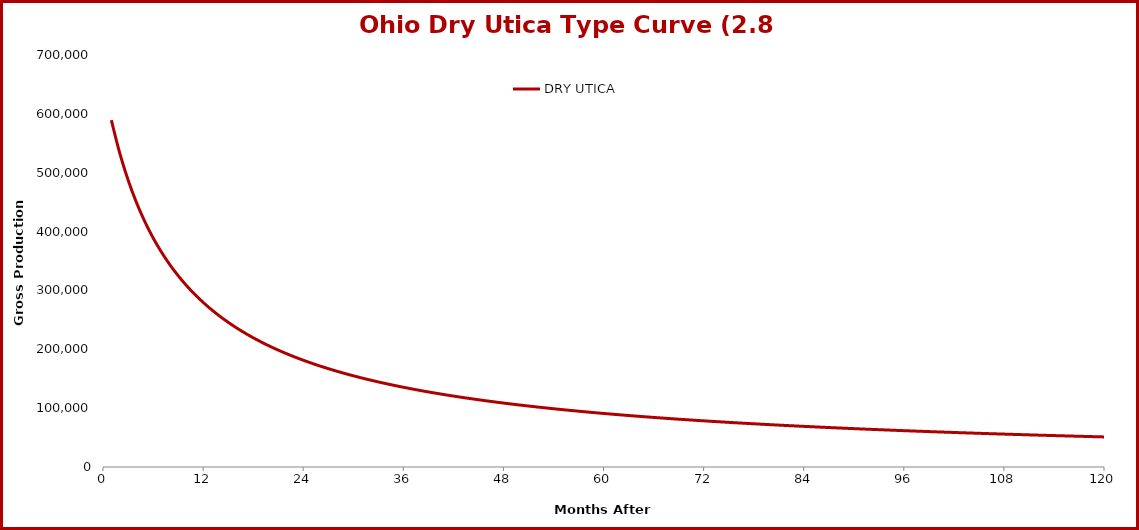
| Category | DRY UTICA |
|---|---|
| 1.0 | 589317 |
| 2.0 | 533595 |
| 3.0 | 487903 |
| 4.0 | 449725 |
| 5.0 | 417326 |
| 6.0 | 389472 |
| 7.0 | 365256 |
| 8.0 | 344001 |
| 9.0 | 325187 |
| 10.0 | 308413 |
| 11.0 | 293358 |
| 12.0 | 279768 |
| 13.0 | 267437 |
| 14.0 | 256194 |
| 15.0 | 245900 |
| 16.0 | 236439 |
| 17.0 | 227710 |
| 18.0 | 219632 |
| 19.0 | 212134 |
| 20.0 | 205153 |
| 21.0 | 198638 |
| 22.0 | 192543 |
| 23.0 | 186828 |
| 24.0 | 181458 |
| 25.0 | 176402 |
| 26.0 | 171634 |
| 27.0 | 167128 |
| 28.0 | 162863 |
| 29.0 | 158821 |
| 30.0 | 154984 |
| 31.0 | 151337 |
| 32.0 | 147865 |
| 33.0 | 144557 |
| 34.0 | 141400 |
| 35.0 | 138384 |
| 36.0 | 135501 |
| 37.0 | 132741 |
| 38.0 | 130096 |
| 39.0 | 127560 |
| 40.0 | 125125 |
| 41.0 | 122786 |
| 42.0 | 120537 |
| 43.0 | 118373 |
| 44.0 | 116288 |
| 45.0 | 114280 |
| 46.0 | 112343 |
| 47.0 | 110473 |
| 48.0 | 108668 |
| 49.0 | 106923 |
| 50.0 | 105237 |
| 51.0 | 103605 |
| 52.0 | 102025 |
| 53.0 | 100496 |
| 54.0 | 99013 |
| 55.0 | 97576 |
| 56.0 | 96182 |
| 57.0 | 94829 |
| 58.0 | 93516 |
| 59.0 | 92240 |
| 60.0 | 91000 |
| 61.0 | 89794 |
| 62.0 | 88622 |
| 63.0 | 87481 |
| 64.0 | 86371 |
| 65.0 | 85290 |
| 66.0 | 84237 |
| 67.0 | 83211 |
| 68.0 | 82211 |
| 69.0 | 81235 |
| 70.0 | 80284 |
| 71.0 | 79356 |
| 72.0 | 78450 |
| 73.0 | 77566 |
| 74.0 | 76702 |
| 75.0 | 75858 |
| 76.0 | 75033 |
| 77.0 | 74227 |
| 78.0 | 73439 |
| 79.0 | 72669 |
| 80.0 | 71915 |
| 81.0 | 71177 |
| 82.0 | 70455 |
| 83.0 | 69748 |
| 84.0 | 69057 |
| 85.0 | 68379 |
| 86.0 | 67715 |
| 87.0 | 67064 |
| 88.0 | 66427 |
| 89.0 | 65802 |
| 90.0 | 65189 |
| 91.0 | 64588 |
| 92.0 | 63999 |
| 93.0 | 63421 |
| 94.0 | 62854 |
| 95.0 | 62297 |
| 96.0 | 61750 |
| 97.0 | 61214 |
| 98.0 | 60687 |
| 99.0 | 60170 |
| 100.0 | 59661 |
| 101.0 | 59162 |
| 102.0 | 58672 |
| 103.0 | 58189 |
| 104.0 | 57716 |
| 105.0 | 57250 |
| 106.0 | 56792 |
| 107.0 | 56341 |
| 108.0 | 55898 |
| 109.0 | 55463 |
| 110.0 | 55034 |
| 111.0 | 54612 |
| 112.0 | 54197 |
| 113.0 | 53789 |
| 114.0 | 53387 |
| 115.0 | 52991 |
| 116.0 | 52601 |
| 117.0 | 52218 |
| 118.0 | 51840 |
| 119.0 | 51468 |
| 120.0 | 51101 |
| 121.0 | 50740 |
| 122.0 | 50384 |
| 123.0 | 50034 |
| 124.0 | 49688 |
| 125.0 | 49347 |
| 126.0 | 49012 |
| 127.0 | 48681 |
| 128.0 | 48354 |
| 129.0 | 48033 |
| 130.0 | 47715 |
| 131.0 | 47403 |
| 132.0 | 47094 |
| 133.0 | 46789 |
| 134.0 | 46489 |
| 135.0 | 46193 |
| 136.0 | 45900 |
| 137.0 | 45612 |
| 138.0 | 45327 |
| 139.0 | 45046 |
| 140.0 | 44769 |
| 141.0 | 44495 |
| 142.0 | 44225 |
| 143.0 | 43958 |
| 144.0 | 43694 |
| 145.0 | 43434 |
| 146.0 | 43177 |
| 147.0 | 42923 |
| 148.0 | 42672 |
| 149.0 | 42425 |
| 150.0 | 42180 |
| 151.0 | 41938 |
| 152.0 | 41700 |
| 153.0 | 41464 |
| 154.0 | 41230 |
| 155.0 | 41000 |
| 156.0 | 40772 |
| 157.0 | 40547 |
| 158.0 | 40324 |
| 159.0 | 40104 |
| 160.0 | 39887 |
| 161.0 | 39672 |
| 162.0 | 39459 |
| 163.0 | 39249 |
| 164.0 | 39041 |
| 165.0 | 38836 |
| 166.0 | 38632 |
| 167.0 | 38431 |
| 168.0 | 38232 |
| 169.0 | 38035 |
| 170.0 | 37840 |
| 171.0 | 37645 |
| 172.0 | 37451 |
| 173.0 | 37259 |
| 174.0 | 37067 |
| 175.0 | 36877 |
| 176.0 | 36687 |
| 177.0 | 36498 |
| 178.0 | 36311 |
| 179.0 | 36124 |
| 180.0 | 35938 |
| 181.0 | 35753 |
| 182.0 | 35569 |
| 183.0 | 35386 |
| 184.0 | 35204 |
| 185.0 | 35023 |
| 186.0 | 34843 |
| 187.0 | 34664 |
| 188.0 | 34486 |
| 189.0 | 34308 |
| 190.0 | 34132 |
| 191.0 | 33956 |
| 192.0 | 33782 |
| 193.0 | 33608 |
| 194.0 | 33435 |
| 195.0 | 33263 |
| 196.0 | 33092 |
| 197.0 | 32922 |
| 198.0 | 32753 |
| 199.0 | 32584 |
| 200.0 | 32417 |
| 201.0 | 32250 |
| 202.0 | 32084 |
| 203.0 | 31919 |
| 204.0 | 31755 |
| 205.0 | 31592 |
| 206.0 | 31429 |
| 207.0 | 31267 |
| 208.0 | 31107 |
| 209.0 | 30947 |
| 210.0 | 30787 |
| 211.0 | 30629 |
| 212.0 | 30472 |
| 213.0 | 30315 |
| 214.0 | 30159 |
| 215.0 | 30004 |
| 216.0 | 29850 |
| 217.0 | 29696 |
| 218.0 | 29543 |
| 219.0 | 29391 |
| 220.0 | 29240 |
| 221.0 | 29090 |
| 222.0 | 28940 |
| 223.0 | 28791 |
| 224.0 | 28643 |
| 225.0 | 28496 |
| 226.0 | 28349 |
| 227.0 | 28204 |
| 228.0 | 28059 |
| 229.0 | 27914 |
| 230.0 | 27771 |
| 231.0 | 27628 |
| 232.0 | 27486 |
| 233.0 | 27344 |
| 234.0 | 27204 |
| 235.0 | 27064 |
| 236.0 | 26925 |
| 237.0 | 26786 |
| 238.0 | 26648 |
| 239.0 | 26511 |
| 240.0 | 26375 |
| 241.0 | 26239 |
| 242.0 | 26104 |
| 243.0 | 25970 |
| 244.0 | 25837 |
| 245.0 | 25704 |
| 246.0 | 25572 |
| 247.0 | 25440 |
| 248.0 | 25309 |
| 249.0 | 25179 |
| 250.0 | 25050 |
| 251.0 | 24921 |
| 252.0 | 24793 |
| 253.0 | 24665 |
| 254.0 | 24538 |
| 255.0 | 24412 |
| 256.0 | 24286 |
| 257.0 | 24162 |
| 258.0 | 24037 |
| 259.0 | 23914 |
| 260.0 | 23791 |
| 261.0 | 23668 |
| 262.0 | 23547 |
| 263.0 | 23425 |
| 264.0 | 23305 |
| 265.0 | 23185 |
| 266.0 | 23066 |
| 267.0 | 22947 |
| 268.0 | 22829 |
| 269.0 | 22712 |
| 270.0 | 22595 |
| 271.0 | 22479 |
| 272.0 | 22363 |
| 273.0 | 22248 |
| 274.0 | 22134 |
| 275.0 | 22020 |
| 276.0 | 21907 |
| 277.0 | 21794 |
| 278.0 | 21682 |
| 279.0 | 21570 |
| 280.0 | 21460 |
| 281.0 | 21349 |
| 282.0 | 21239 |
| 283.0 | 21130 |
| 284.0 | 21021 |
| 285.0 | 20913 |
| 286.0 | 20806 |
| 287.0 | 20699 |
| 288.0 | 20592 |
| 289.0 | 20486 |
| 290.0 | 20381 |
| 291.0 | 20276 |
| 292.0 | 20172 |
| 293.0 | 20068 |
| 294.0 | 19965 |
| 295.0 | 19862 |
| 296.0 | 19760 |
| 297.0 | 19659 |
| 298.0 | 19557 |
| 299.0 | 19457 |
| 300.0 | 19357 |
| 301.0 | 19257 |
| 302.0 | 19158 |
| 303.0 | 19060 |
| 304.0 | 18962 |
| 305.0 | 18864 |
| 306.0 | 18767 |
| 307.0 | 18671 |
| 308.0 | 18575 |
| 309.0 | 18479 |
| 310.0 | 18384 |
| 311.0 | 18289 |
| 312.0 | 18195 |
| 313.0 | 18102 |
| 314.0 | 18009 |
| 315.0 | 17916 |
| 316.0 | 17824 |
| 317.0 | 17732 |
| 318.0 | 17641 |
| 319.0 | 17550 |
| 320.0 | 17460 |
| 321.0 | 17370 |
| 322.0 | 17281 |
| 323.0 | 17192 |
| 324.0 | 17104 |
| 325.0 | 17016 |
| 326.0 | 16928 |
| 327.0 | 16841 |
| 328.0 | 16754 |
| 329.0 | 16668 |
| 330.0 | 16583 |
| 331.0 | 16497 |
| 332.0 | 16412 |
| 333.0 | 16328 |
| 334.0 | 16244 |
| 335.0 | 16161 |
| 336.0 | 16077 |
| 337.0 | 15995 |
| 338.0 | 15912 |
| 339.0 | 15831 |
| 340.0 | 15749 |
| 341.0 | 15668 |
| 342.0 | 15588 |
| 343.0 | 15507 |
| 344.0 | 15428 |
| 345.0 | 15348 |
| 346.0 | 15269 |
| 347.0 | 15191 |
| 348.0 | 15113 |
| 349.0 | 15035 |
| 350.0 | 14958 |
| 351.0 | 14881 |
| 352.0 | 14804 |
| 353.0 | 14728 |
| 354.0 | 14652 |
| 355.0 | 14577 |
| 356.0 | 14502 |
| 357.0 | 14427 |
| 358.0 | 14353 |
| 359.0 | 14279 |
| 360.0 | 14206 |
| 361.0 | 14133 |
| 362.0 | 14060 |
| 363.0 | 13988 |
| 364.0 | 13916 |
| 365.0 | 13844 |
| 366.0 | 13773 |
| 367.0 | 13702 |
| 368.0 | 13632 |
| 369.0 | 13562 |
| 370.0 | 13492 |
| 371.0 | 13423 |
| 372.0 | 13354 |
| 373.0 | 13285 |
| 374.0 | 13217 |
| 375.0 | 13149 |
| 376.0 | 13081 |
| 377.0 | 13014 |
| 378.0 | 12947 |
| 379.0 | 12880 |
| 380.0 | 12814 |
| 381.0 | 12748 |
| 382.0 | 12683 |
| 383.0 | 12617 |
| 384.0 | 12552 |
| 385.0 | 12488 |
| 386.0 | 12424 |
| 387.0 | 12360 |
| 388.0 | 12296 |
| 389.0 | 12233 |
| 390.0 | 12170 |
| 391.0 | 12107 |
| 392.0 | 12045 |
| 393.0 | 11983 |
| 394.0 | 11922 |
| 395.0 | 11860 |
| 396.0 | 11799 |
| 397.0 | 11739 |
| 398.0 | 11678 |
| 399.0 | 11618 |
| 400.0 | 11558 |
| 401.0 | 11499 |
| 402.0 | 11440 |
| 403.0 | 11381 |
| 404.0 | 11322 |
| 405.0 | 11264 |
| 406.0 | 11206 |
| 407.0 | 11149 |
| 408.0 | 11091 |
| 409.0 | 11034 |
| 410.0 | 10978 |
| 411.0 | 10921 |
| 412.0 | 10865 |
| 413.0 | 10809 |
| 414.0 | 10753 |
| 415.0 | 10698 |
| 416.0 | 10643 |
| 417.0 | 10588 |
| 418.0 | 10534 |
| 419.0 | 10480 |
| 420.0 | 10426 |
| 421.0 | 10372 |
| 422.0 | 10319 |
| 423.0 | 10266 |
| 424.0 | 10213 |
| 425.0 | 10160 |
| 426.0 | 10108 |
| 427.0 | 10056 |
| 428.0 | 10005 |
| 429.0 | 9953 |
| 430.0 | 9902 |
| 431.0 | 9851 |
| 432.0 | 9800 |
| 433.0 | 9750 |
| 434.0 | 9700 |
| 435.0 | 9650 |
| 436.0 | 9600 |
| 437.0 | 9551 |
| 438.0 | 9502 |
| 439.0 | 9453 |
| 440.0 | 9404 |
| 441.0 | 9356 |
| 442.0 | 9308 |
| 443.0 | 9260 |
| 444.0 | 9212 |
| 445.0 | 9165 |
| 446.0 | 9118 |
| 447.0 | 9071 |
| 448.0 | 9024 |
| 449.0 | 8978 |
| 450.0 | 8932 |
| 451.0 | 8886 |
| 452.0 | 8840 |
| 453.0 | 8795 |
| 454.0 | 8749 |
| 455.0 | 8704 |
| 456.0 | 8660 |
| 457.0 | 8615 |
| 458.0 | 8571 |
| 459.0 | 8527 |
| 460.0 | 8483 |
| 461.0 | 8439 |
| 462.0 | 8396 |
| 463.0 | 8353 |
| 464.0 | 8310 |
| 465.0 | 8267 |
| 466.0 | 8224 |
| 467.0 | 8182 |
| 468.0 | 8140 |
| 469.0 | 8098 |
| 470.0 | 8056 |
| 471.0 | 8015 |
| 472.0 | 7974 |
| 473.0 | 7933 |
| 474.0 | 7892 |
| 475.0 | 7851 |
| 476.0 | 7811 |
| 477.0 | 7771 |
| 478.0 | 7731 |
| 479.0 | 7691 |
| 480.0 | 7652 |
| 481.0 | 7612 |
| 482.0 | 7573 |
| 483.0 | 7534 |
| 484.0 | 7495 |
| 485.0 | 7457 |
| 486.0 | 7418 |
| 487.0 | 7380 |
| 488.0 | 7342 |
| 489.0 | 7305 |
| 490.0 | 7267 |
| 491.0 | 7230 |
| 492.0 | 7192 |
| 493.0 | 7155 |
| 494.0 | 7119 |
| 495.0 | 7082 |
| 496.0 | 7046 |
| 497.0 | 7009 |
| 498.0 | 6973 |
| 499.0 | 6938 |
| 500.0 | 6902 |
| 501.0 | 6866 |
| 502.0 | 6831 |
| 503.0 | 6796 |
| 504.0 | 6761 |
| 505.0 | 6726 |
| 506.0 | 6692 |
| 507.0 | 6657 |
| 508.0 | 6623 |
| 509.0 | 6589 |
| 510.0 | 6555 |
| 511.0 | 6521 |
| 512.0 | 6488 |
| 513.0 | 6454 |
| 514.0 | 6421 |
| 515.0 | 6388 |
| 516.0 | 6355 |
| 517.0 | 6323 |
| 518.0 | 6290 |
| 519.0 | 6258 |
| 520.0 | 6226 |
| 521.0 | 6194 |
| 522.0 | 6162 |
| 523.0 | 6130 |
| 524.0 | 6098 |
| 525.0 | 6067 |
| 526.0 | 6036 |
| 527.0 | 6005 |
| 528.0 | 5974 |
| 529.0 | 5943 |
| 530.0 | 5913 |
| 531.0 | 5882 |
| 532.0 | 5852 |
| 533.0 | 5822 |
| 534.0 | 5792 |
| 535.0 | 5762 |
| 536.0 | 5733 |
| 537.0 | 5703 |
| 538.0 | 5674 |
| 539.0 | 5645 |
| 540.0 | 5616 |
| 541.0 | 5587 |
| 542.0 | 5558 |
| 543.0 | 5529 |
| 544.0 | 5501 |
| 545.0 | 5473 |
| 546.0 | 5444 |
| 547.0 | 5416 |
| 548.0 | 5389 |
| 549.0 | 5361 |
| 550.0 | 5333 |
| 551.0 | 5306 |
| 552.0 | 5279 |
| 553.0 | 5251 |
| 554.0 | 5224 |
| 555.0 | 5198 |
| 556.0 | 5171 |
| 557.0 | 5144 |
| 558.0 | 5118 |
| 559.0 | 5091 |
| 560.0 | 5065 |
| 561.0 | 5039 |
| 562.0 | 5013 |
| 563.0 | 4988 |
| 564.0 | 4962 |
| 565.0 | 4936 |
| 566.0 | 4911 |
| 567.0 | 4886 |
| 568.0 | 4861 |
| 569.0 | 4836 |
| 570.0 | 4811 |
| 571.0 | 4786 |
| 572.0 | 4761 |
| 573.0 | 4737 |
| 574.0 | 4713 |
| 575.0 | 4688 |
| 576.0 | 4664 |
| 577.0 | 4640 |
| 578.0 | 4616 |
| 579.0 | 4593 |
| 580.0 | 4569 |
| 581.0 | 4545 |
| 582.0 | 4522 |
| 583.0 | 4499 |
| 584.0 | 4476 |
| 585.0 | 4453 |
| 586.0 | 4430 |
| 587.0 | 4407 |
| 588.0 | 4384 |
| 589.0 | 4362 |
| 590.0 | 4339 |
| 591.0 | 4317 |
| 592.0 | 4295 |
| 593.0 | 4273 |
| 594.0 | 4251 |
| 595.0 | 4229 |
| 596.0 | 4207 |
| 597.0 | 4186 |
| 598.0 | 4164 |
| 599.0 | 4143 |
| 600.0 | 4121 |
| 601.0 | 4100 |
| 602.0 | 4079 |
| 603.0 | 4058 |
| 604.0 | 4037 |
| 605.0 | 4016 |
| 606.0 | 3996 |
| 607.0 | 3975 |
| 608.0 | 3955 |
| 609.0 | 3934 |
| 610.0 | 3914 |
| 611.0 | 3894 |
| 612.0 | 3874 |
| 613.0 | 3854 |
| 614.0 | 3834 |
| 615.0 | 3815 |
| 616.0 | 3795 |
| 617.0 | 3775 |
| 618.0 | 3756 |
| 619.0 | 3737 |
| 620.0 | 3717 |
| 621.0 | 3698 |
| 622.0 | 3679 |
| 623.0 | 3660 |
| 624.0 | 3642 |
| 625.0 | 3623 |
| 626.0 | 3604 |
| 627.0 | 3586 |
| 628.0 | 3567 |
| 629.0 | 3549 |
| 630.0 | 3531 |
| 631.0 | 3512 |
| 632.0 | 3494 |
| 633.0 | 3476 |
| 634.0 | 3459 |
| 635.0 | 3441 |
| 636.0 | 3423 |
| 637.0 | 3405 |
| 638.0 | 3388 |
| 639.0 | 3371 |
| 640.0 | 3353 |
| 641.0 | 3336 |
| 642.0 | 3319 |
| 643.0 | 3302 |
| 644.0 | 3285 |
| 645.0 | 3268 |
| 646.0 | 3251 |
| 647.0 | 3234 |
| 648.0 | 3218 |
| 649.0 | 3201 |
| 650.0 | 3185 |
| 651.0 | 3168 |
| 652.0 | 3152 |
| 653.0 | 3136 |
| 654.0 | 3120 |
| 655.0 | 3104 |
| 656.0 | 3088 |
| 657.0 | 3072 |
| 658.0 | 3056 |
| 659.0 | 3040 |
| 660.0 | 3025 |
| 661.0 | 3009 |
| 662.0 | 2994 |
| 663.0 | 2978 |
| 664.0 | 2963 |
| 665.0 | 2948 |
| 666.0 | 2932 |
| 667.0 | 2917 |
| 668.0 | 2902 |
| 669.0 | 2887 |
| 670.0 | 2873 |
| 671.0 | 2858 |
| 672.0 | 2843 |
| 673.0 | 2829 |
| 674.0 | 2814 |
| 675.0 | 2799 |
| 676.0 | 2785 |
| 677.0 | 2771 |
| 678.0 | 2757 |
| 679.0 | 2742 |
| 680.0 | 2728 |
| 681.0 | 2714 |
| 682.0 | 2700 |
| 683.0 | 2686 |
| 684.0 | 2673 |
| 685.0 | 2659 |
| 686.0 | 2645 |
| 687.0 | 2632 |
| 688.0 | 2618 |
| 689.0 | 2605 |
| 690.0 | 2591 |
| 691.0 | 2578 |
| 692.0 | 2565 |
| 693.0 | 2551 |
| 694.0 | 2538 |
| 695.0 | 2525 |
| 696.0 | 2512 |
| 697.0 | 2499 |
| 698.0 | 2486 |
| 699.0 | 2474 |
| 700.0 | 2461 |
| 701.0 | 2448 |
| 702.0 | 2436 |
| 703.0 | 2423 |
| 704.0 | 2411 |
| 705.0 | 2398 |
| 706.0 | 2386 |
| 707.0 | 2374 |
| 708.0 | 2361 |
| 709.0 | 2349 |
| 710.0 | 2337 |
| 711.0 | 2325 |
| 712.0 | 2313 |
| 713.0 | 2301 |
| 714.0 | 2290 |
| 715.0 | 2278 |
| 716.0 | 2266 |
| 717.0 | 2254 |
| 718.0 | 2243 |
| 719.0 | 2231 |
| 720.0 | 2220 |
| 721.0 | 2208 |
| 722.0 | 2197 |
| 723.0 | 2186 |
| 724.0 | 2174 |
| 725.0 | 2163 |
| 726.0 | 2152 |
| 727.0 | 2141 |
| 728.0 | 2130 |
| 729.0 | 2119 |
| 730.0 | 2108 |
| 731.0 | 2097 |
| 732.0 | 2087 |
| 733.0 | 2076 |
| 734.0 | 2065 |
| 735.0 | 2055 |
| 736.0 | 2044 |
| 737.0 | 2033 |
| 738.0 | 2023 |
| 739.0 | 2013 |
| 740.0 | 2002 |
| 741.0 | 1992 |
| 742.0 | 1982 |
| 743.0 | 1972 |
| 744.0 | 1961 |
| 745.0 | 1951 |
| 746.0 | 1941 |
| 747.0 | 1931 |
| 748.0 | 1921 |
| 749.0 | 1911 |
| 750.0 | 1902 |
| 751.0 | 1892 |
| 752.0 | 1882 |
| 753.0 | 1872 |
| 754.0 | 1863 |
| 755.0 | 1853 |
| 756.0 | 1844 |
| 757.0 | 1834 |
| 758.0 | 1825 |
| 759.0 | 1815 |
| 760.0 | 1806 |
| 761.0 | 1797 |
| 762.0 | 1788 |
| 763.0 | 1778 |
| 764.0 | 1769 |
| 765.0 | 1760 |
| 766.0 | 1751 |
| 767.0 | 1742 |
| 768.0 | 1733 |
| 769.0 | 1724 |
| 770.0 | 1715 |
| 771.0 | 1706 |
| 772.0 | 1698 |
| 773.0 | 1689 |
| 774.0 | 1680 |
| 775.0 | 1672 |
| 776.0 | 1663 |
| 777.0 | 1654 |
| 778.0 | 1646 |
| 779.0 | 1638 |
| 780.0 | 1629 |